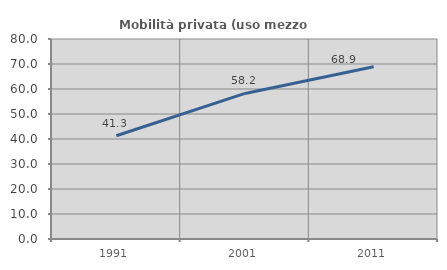
| Category | Mobilità privata (uso mezzo privato) |
|---|---|
| 1991.0 | 41.311 |
| 2001.0 | 58.224 |
| 2011.0 | 68.874 |